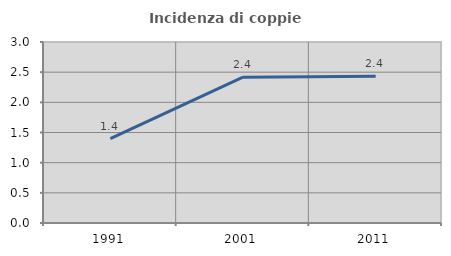
| Category | Incidenza di coppie miste |
|---|---|
| 1991.0 | 1.397 |
| 2001.0 | 2.417 |
| 2011.0 | 2.432 |